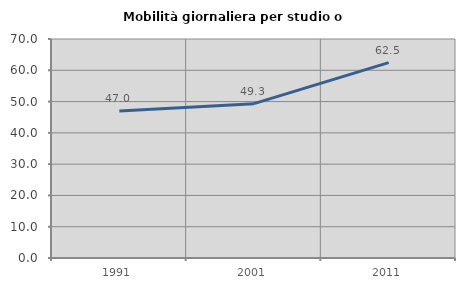
| Category | Mobilità giornaliera per studio o lavoro |
|---|---|
| 1991.0 | 46.969 |
| 2001.0 | 49.334 |
| 2011.0 | 62.456 |